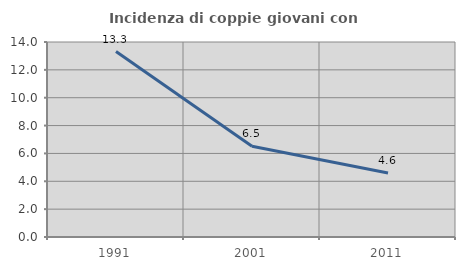
| Category | Incidenza di coppie giovani con figli |
|---|---|
| 1991.0 | 13.316 |
| 2001.0 | 6.522 |
| 2011.0 | 4.595 |